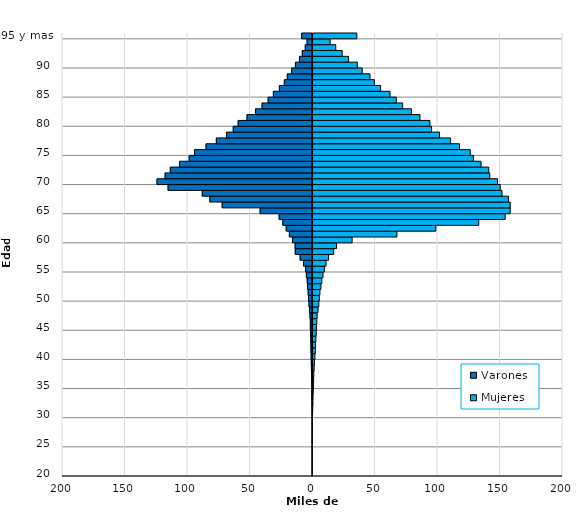
| Category | Varones | Mujeres |
|---|---|---|
| 20 | -31 | 30 |
| 21 | -36 | 39 |
| 22 | -40 | 34 |
| 23 | -56 | 70 |
| 24 | -79 | 82 |
| 25 | -83 | 108 |
| 26 | -117 | 162 |
| 27 | -151 | 233 |
| 28 | -168 | 303 |
| 29 | -225 | 398 |
| 30 | -249 | 439 |
| 31 | -297 | 556 |
| 32 | -357 | 762 |
| 33 | -419 | 823 |
| 34 | -453 | 980 |
| 35 | -494 | 1129 |
| 36 | -543 | 1281 |
| 37 | -715 | 1441 |
| 38 | -875 | 1727 |
| 39 | -966 | 1948 |
| 40 | -1072 | 2314 |
| 41 | -1236 | 2664 |
| 42 | -1296 | 2841 |
| 43 | -1409 | 3116 |
| 44 | -1541 | 3385 |
| 45 | -1722 | 3557 |
| 46 | -1746 | 3858 |
| 47 | -2040 | 4114 |
| 48 | -2422 | 4801 |
| 49 | -2770 | 5440 |
| 50 | -3179 | 5850 |
| 51 | -3480 | 6323 |
| 52 | -3976 | 7154 |
| 53 | -4224 | 7851 |
| 54 | -4891 | 8841 |
| 55 | -5555 | 9890 |
| 56 | -7222 | 11270 |
| 57 | -9904 | 13242 |
| 58 | -13786 | 17342 |
| 59 | -13920 | 19629 |
| 60 | -15951 | 32076 |
| 61 | -18505 | 67970 |
| 62 | -21047 | 99058 |
| 63 | -23755 | 133393 |
| 64 | -26686 | 154511 |
| 65 | -41912 | 158556 |
| 66 | -72251 | 158583 |
| 67 | -82171 | 157171 |
| 68 | -88168 | 152028 |
| 69 | -115545 | 150559 |
| 70 | -124409 | 148432 |
| 71 | -117901 | 142187 |
| 72 | -113764 | 141406 |
| 73 | -106431 | 135239 |
| 74 | -98665 | 129134 |
| 75 | -94393 | 126612 |
| 76 | -85181 | 118003 |
| 77 | -76915 | 110923 |
| 78 | -68823 | 101999 |
| 79 | -63403 | 95619 |
| 80 | -59510 | 94331 |
| 81 | -52363 | 86349 |
| 82 | -45609 | 79553 |
| 83 | -40364 | 72503 |
| 84 | -35465 | 67445 |
| 85 | -31292 | 62440 |
| 86 | -26494 | 54902 |
| 87 | -22522 | 49925 |
| 88 | -20126 | 46406 |
| 89 | -16708 | 40178 |
| 90 | -13656 | 36273 |
| 91 | -10426 | 29257 |
| 92 | -8164 | 24120 |
| 93 | -5761 | 18999 |
| 94 | -4329 | 14487 |
| 95 y mas | -8643 | 35871 |